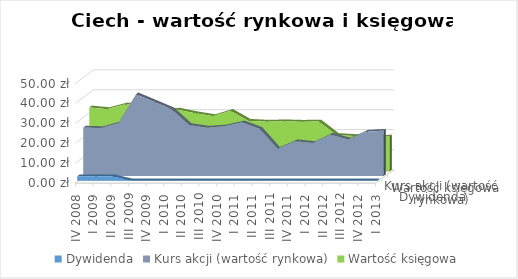
| Category | Dywidenda | Kurs akcji (wartość rynkowa) | Wartość księgowa |
|---|---|---|---|
| IV 2008 | 2.07 | 24.24 | 32.1 |
| I 2009 | 2.07 | 23.99 | 31.218 |
| II 2009 | 2.07 | 26.5 | 33.572 |
| III 2009 | 0 | 40.9 | 33.376 |
| IV 2009 | 0 | 37.2 | 30.493 |
| I 2010 | 0 | 33.44 | 30.96 |
| II 2010 | 0 | 25.5 | 29.152 |
| III 2010 | 0 | 24.2 | 27.719 |
| IV 2010 | 0 | 24.89 | 30.374 |
| I 2011 | 0 | 26.87 | 25.374 |
| II 2011 | 0 | 23.58 | 24.929 |
| III 2011 | 0 | 13.6 | 25.114 |
| IV 2011 | 0 | 17.4 | 24.889 |
| I 2012 | 0 | 16.5 | 25.001 |
| II 2012 | 0 | 20.73 | 18.232 |
| III 2012 | 0 | 18.23 | 17.717 |
| IV 2012 | 0 | 22.2 | 16.702 |
| I 2013 | 0 | 22.7 | 17.556 |